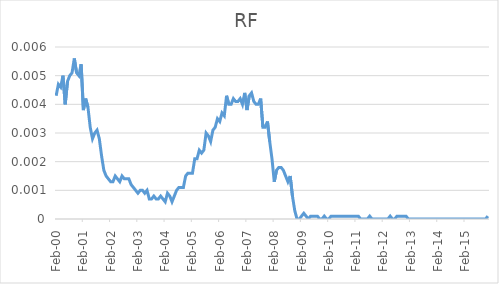
| Category | Series 0 |
|---|---|
| 2000-02-01 | 0.004 |
| 2000-03-01 | 0.005 |
| 2000-04-01 | 0.005 |
| 2000-05-01 | 0.005 |
| 2000-06-01 | 0.004 |
| 2000-07-01 | 0.005 |
| 2000-08-01 | 0.005 |
| 2000-09-01 | 0.005 |
| 2000-10-01 | 0.006 |
| 2000-11-01 | 0.005 |
| 2000-12-01 | 0.005 |
| 2001-01-01 | 0.005 |
| 2001-02-01 | 0.004 |
| 2001-03-01 | 0.004 |
| 2001-04-01 | 0.004 |
| 2001-05-01 | 0.003 |
| 2001-06-01 | 0.003 |
| 2001-07-01 | 0.003 |
| 2001-08-01 | 0.003 |
| 2001-09-01 | 0.003 |
| 2001-10-01 | 0.002 |
| 2001-11-01 | 0.002 |
| 2001-12-01 | 0.002 |
| 2002-01-01 | 0.001 |
| 2002-02-01 | 0.001 |
| 2002-03-01 | 0.001 |
| 2002-04-01 | 0.002 |
| 2002-05-01 | 0.001 |
| 2002-06-01 | 0.001 |
| 2002-07-01 | 0.002 |
| 2002-08-01 | 0.001 |
| 2002-09-01 | 0.001 |
| 2002-10-01 | 0.001 |
| 2002-11-01 | 0.001 |
| 2002-12-01 | 0.001 |
| 2003-01-01 | 0.001 |
| 2003-02-01 | 0.001 |
| 2003-03-01 | 0.001 |
| 2003-04-01 | 0.001 |
| 2003-05-01 | 0.001 |
| 2003-06-01 | 0.001 |
| 2003-07-01 | 0.001 |
| 2003-08-01 | 0.001 |
| 2003-09-01 | 0.001 |
| 2003-10-01 | 0.001 |
| 2003-11-01 | 0.001 |
| 2003-12-01 | 0.001 |
| 2004-01-01 | 0.001 |
| 2004-02-01 | 0.001 |
| 2004-03-01 | 0.001 |
| 2004-04-01 | 0.001 |
| 2004-05-01 | 0.001 |
| 2004-06-01 | 0.001 |
| 2004-07-01 | 0.001 |
| 2004-08-01 | 0.001 |
| 2004-09-01 | 0.001 |
| 2004-10-01 | 0.001 |
| 2004-11-01 | 0.002 |
| 2004-12-01 | 0.002 |
| 2005-01-01 | 0.002 |
| 2005-02-01 | 0.002 |
| 2005-03-01 | 0.002 |
| 2005-04-01 | 0.002 |
| 2005-05-01 | 0.002 |
| 2005-06-01 | 0.002 |
| 2005-07-01 | 0.002 |
| 2005-08-01 | 0.003 |
| 2005-09-01 | 0.003 |
| 2005-10-01 | 0.003 |
| 2005-11-01 | 0.003 |
| 2005-12-01 | 0.003 |
| 2006-01-01 | 0.004 |
| 2006-02-01 | 0.003 |
| 2006-03-01 | 0.004 |
| 2006-04-01 | 0.004 |
| 2006-05-01 | 0.004 |
| 2006-06-01 | 0.004 |
| 2006-07-01 | 0.004 |
| 2006-08-01 | 0.004 |
| 2006-09-01 | 0.004 |
| 2006-10-01 | 0.004 |
| 2006-11-01 | 0.004 |
| 2006-12-01 | 0.004 |
| 2007-01-01 | 0.004 |
| 2007-02-01 | 0.004 |
| 2007-03-01 | 0.004 |
| 2007-04-01 | 0.004 |
| 2007-05-01 | 0.004 |
| 2007-06-01 | 0.004 |
| 2007-07-01 | 0.004 |
| 2007-08-01 | 0.004 |
| 2007-09-01 | 0.003 |
| 2007-10-01 | 0.003 |
| 2007-11-01 | 0.003 |
| 2007-12-01 | 0.003 |
| 2008-01-01 | 0.002 |
| 2008-02-01 | 0.001 |
| 2008-03-01 | 0.002 |
| 2008-04-01 | 0.002 |
| 2008-05-01 | 0.002 |
| 2008-06-01 | 0.002 |
| 2008-07-01 | 0.002 |
| 2008-08-01 | 0.001 |
| 2008-09-01 | 0.002 |
| 2008-10-01 | 0.001 |
| 2008-11-01 | 0 |
| 2008-12-01 | 0 |
| 2009-01-01 | 0 |
| 2009-02-01 | 0 |
| 2009-03-01 | 0 |
| 2009-04-01 | 0 |
| 2009-05-01 | 0 |
| 2009-06-01 | 0 |
| 2009-07-01 | 0 |
| 2009-08-01 | 0 |
| 2009-09-01 | 0 |
| 2009-10-01 | 0 |
| 2009-11-01 | 0 |
| 2009-12-01 | 0 |
| 2010-01-01 | 0 |
| 2010-02-01 | 0 |
| 2010-03-01 | 0 |
| 2010-04-01 | 0 |
| 2010-05-01 | 0 |
| 2010-06-01 | 0 |
| 2010-07-01 | 0 |
| 2010-08-01 | 0 |
| 2010-09-01 | 0 |
| 2010-10-01 | 0 |
| 2010-11-01 | 0 |
| 2010-12-01 | 0 |
| 2011-01-01 | 0 |
| 2011-02-01 | 0 |
| 2011-03-01 | 0 |
| 2011-04-01 | 0 |
| 2011-05-01 | 0 |
| 2011-06-01 | 0 |
| 2011-07-01 | 0 |
| 2011-08-01 | 0 |
| 2011-09-01 | 0 |
| 2011-10-01 | 0 |
| 2011-11-01 | 0 |
| 2011-12-01 | 0 |
| 2012-01-01 | 0 |
| 2012-02-01 | 0 |
| 2012-03-01 | 0 |
| 2012-04-01 | 0 |
| 2012-05-01 | 0 |
| 2012-06-01 | 0 |
| 2012-07-01 | 0 |
| 2012-08-01 | 0 |
| 2012-09-01 | 0 |
| 2012-10-01 | 0 |
| 2012-11-01 | 0 |
| 2012-12-01 | 0 |
| 2013-01-01 | 0 |
| 2013-02-01 | 0 |
| 2013-03-01 | 0 |
| 2013-04-01 | 0 |
| 2013-05-01 | 0 |
| 2013-06-01 | 0 |
| 2013-07-01 | 0 |
| 2013-08-01 | 0 |
| 2013-09-01 | 0 |
| 2013-10-01 | 0 |
| 2013-11-01 | 0 |
| 2013-12-01 | 0 |
| 2014-01-01 | 0 |
| 2014-02-01 | 0 |
| 2014-03-01 | 0 |
| 2014-04-01 | 0 |
| 2014-05-01 | 0 |
| 2014-06-01 | 0 |
| 2014-07-01 | 0 |
| 2014-08-01 | 0 |
| 2014-09-01 | 0 |
| 2014-10-01 | 0 |
| 2014-11-01 | 0 |
| 2014-12-01 | 0 |
| 2015-01-01 | 0 |
| 2015-02-01 | 0 |
| 2015-03-01 | 0 |
| 2015-04-01 | 0 |
| 2015-05-01 | 0 |
| 2015-06-01 | 0 |
| 2015-07-01 | 0 |
| 2015-08-01 | 0 |
| 2015-09-01 | 0 |
| 2015-10-01 | 0 |
| 2015-11-01 | 0 |
| 2015-12-01 | 0 |